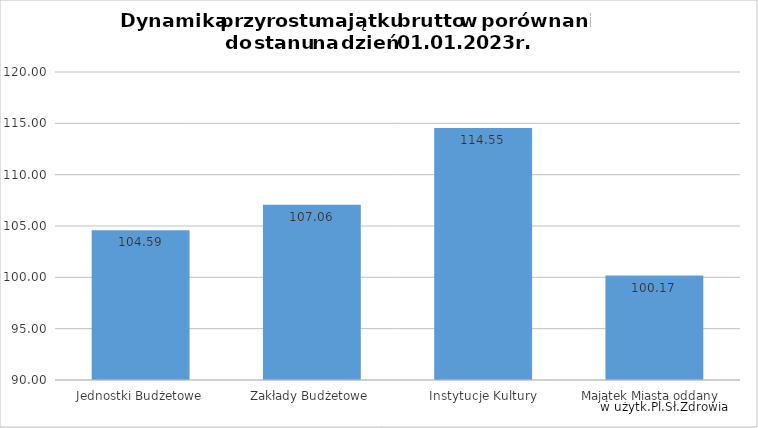
| Category | Dynamika przyrostu majątku brutto w porównaniu do stanu na dzień 01.01 |
|---|---|
| Jednostki Budżetowe | 104.59 |
| Zakłady Budżetowe | 107.06 |
| Instytucje Kultury | 114.55 |
| Majątek Miasta oddany  | 100.17 |